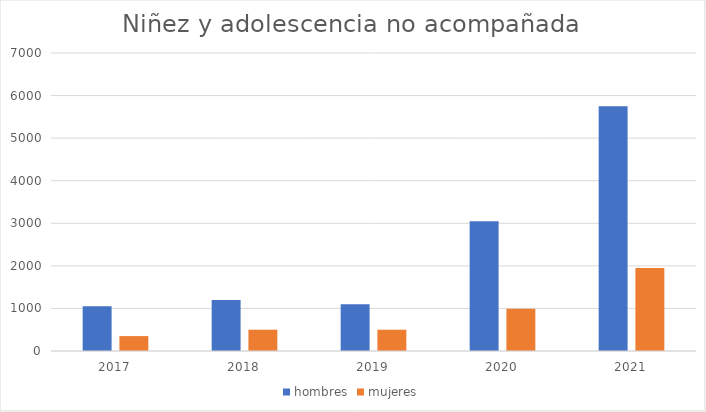
| Category | hombres | mujeres |
|---|---|---|
| 2017.0 | 1050 | 350 |
| 2018.0 | 1200 | 500 |
| 2019.0 | 1100 | 500 |
| 2020.0 | 3050 | 990 |
| 2021.0 | 5750 | 1950 |